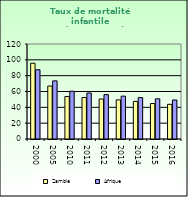
| Category | Zambie | Afrique                        |
|---|---|---|
| 2000.0 | 95.7 | 87.462 |
| 2005.0 | 66.9 | 73.418 |
| 2010.0 | 53.6 | 60.345 |
| 2011.0 | 52.4 | 58.107 |
| 2012.0 | 50.5 | 56.032 |
| 2013.0 | 49.4 | 54.131 |
| 2014.0 | 47.5 | 52.336 |
| 2015.0 | 44.8 | 50.754 |
| 2016.0 | 43.8 | 49.283 |